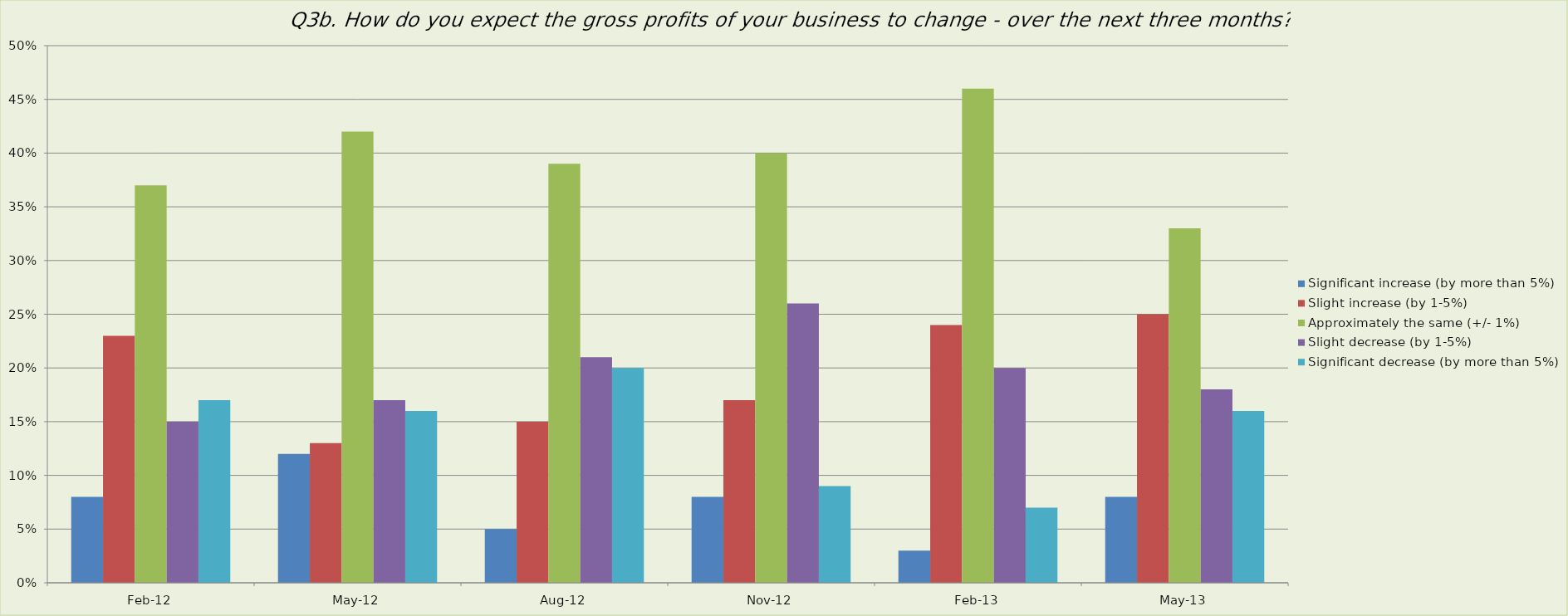
| Category | Significant increase (by more than 5%) | Slight increase (by 1-5%) | Approximately the same (+/- 1%) | Slight decrease (by 1-5%) | Significant decrease (by more than 5%) |
|---|---|---|---|---|---|
| 2012-02-01 | 0.08 | 0.23 | 0.37 | 0.15 | 0.17 |
| 2012-05-01 | 0.12 | 0.13 | 0.42 | 0.17 | 0.16 |
| 2012-08-01 | 0.05 | 0.15 | 0.39 | 0.21 | 0.2 |
| 2012-11-01 | 0.08 | 0.17 | 0.4 | 0.26 | 0.09 |
| 2013-02-01 | 0.03 | 0.24 | 0.46 | 0.2 | 0.07 |
| 2013-05-01 | 0.08 | 0.25 | 0.33 | 0.18 | 0.16 |